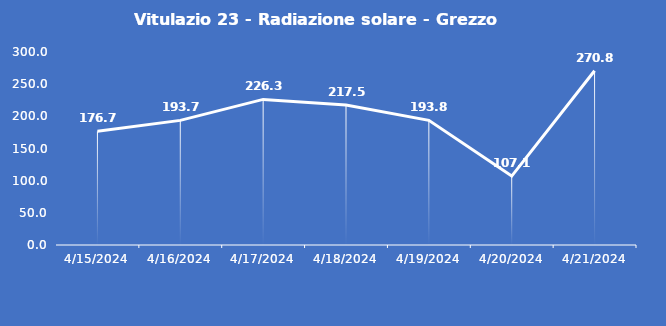
| Category | Vitulazio 23 - Radiazione solare - Grezzo (W/m2) |
|---|---|
| 4/15/24 | 176.7 |
| 4/16/24 | 193.7 |
| 4/17/24 | 226.3 |
| 4/18/24 | 217.5 |
| 4/19/24 | 193.8 |
| 4/20/24 | 107.1 |
| 4/21/24 | 270.8 |